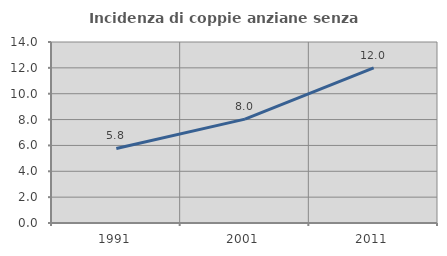
| Category | Incidenza di coppie anziane senza figli  |
|---|---|
| 1991.0 | 5.765 |
| 2001.0 | 8.032 |
| 2011.0 | 12.007 |